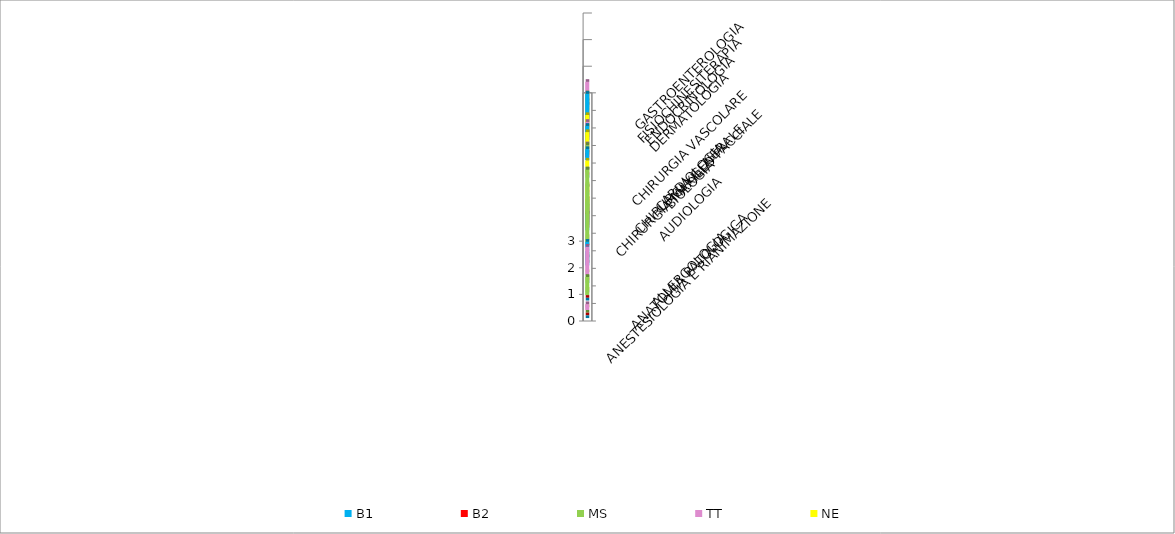
| Category | B1 | B2 | MS | TT | NE |
|---|---|---|---|---|---|
| ALLERGOLOGIA | 0 | 0 | 0 | 0.219 | 0 |
| ANATOMIA PATOLOGICA | 0 | 0 | 0.684 | 0 | 0 |
| ANESTESIOLOGIA E RIANIMAZIONE | 0 | 0 | 0 | 1.058 | 0 |
| AUDIOLOGIA | 0.543 | 0 | 0.108 | 0 | 0 |
| BIOLOGIA | 0.228 | 0 | 2.735 | 0 | 0 |
| CARDIOLOGIA | 0.614 | 0.552 | 0.864 | 0.456 | 1.253 |
| CHIRURGIA GENERALE | 0.3 | 0.121 | 0.297 | 0.219 | 0.142 |
| CHIRURGIA MAXILLO FACCIALE | 0 | 0 | 0.108 | 0 | 0 |
| CHIRURGIA VASCOLARE | 0 | 0 | 0.108 | 0 | 0.236 |
| DERMATOLOGIA | 0.414 | 0.173 | 0.36 | 0.288 | 0.648 |
| ENDOCRINOLOGIA | 0.628 | 0.286 | 0.371 | 0.471 | 0.628 |
| FISIOCHINESITERAPIA | 1.171 | 0.228 | 0.728 | 0.571 | 0.143 |
| GASTROENTEROLOGIA | 0.1 | 0 | 0.328 | 0.657 | 0 |